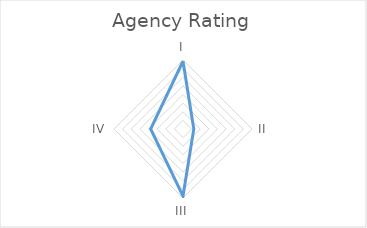
| Category | Series 0 |
|---|---|
| I | 1.571 |
| II | 0.25 |
| III | 1.556 |
| IV | 0.75 |